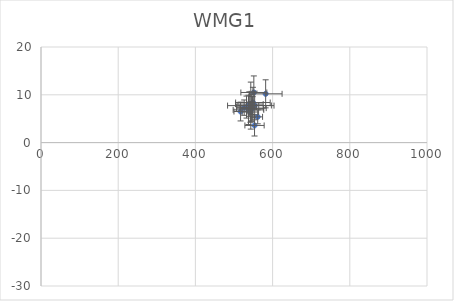
| Category | WMG1 |
|---|---|
| 549.0318350294543 | 8.383 |
| 543.5142457381179 | 7.738 |
| 551.4004564609562 | 10.486 |
| 537.4969997155148 | 6.849 |
| 582.0067213923866 | 10.204 |
| 539.7354552878043 | 8.059 |
| 544.8972330420254 | 7.213 |
| 517.0755347322892 | 6.5 |
| 553.5791320519893 | 7.763 |
| 532.4540489896419 | 7.43 |
| 553.190977316195 | 3.589 |
| 526.3665798158163 | 7.309 |
| 546.7550047333631 | 7.102 |
| 561.4092429811607 | 5.388 |
| 542.4289706127606 | 6.401 |
| 548.2963141158191 | 7.745 |